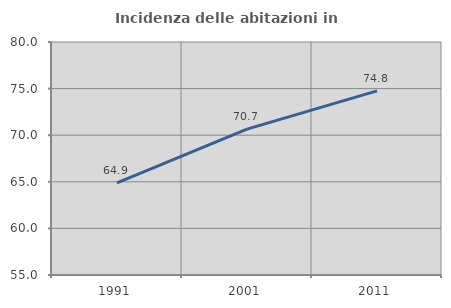
| Category | Incidenza delle abitazioni in proprietà  |
|---|---|
| 1991.0 | 64.878 |
| 2001.0 | 70.654 |
| 2011.0 | 74.76 |